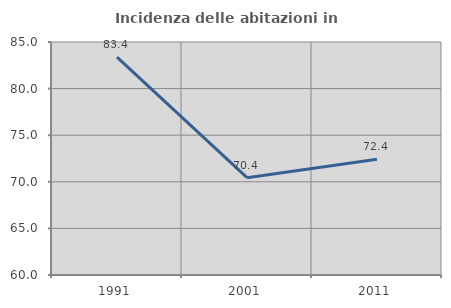
| Category | Incidenza delle abitazioni in proprietà  |
|---|---|
| 1991.0 | 83.369 |
| 2001.0 | 70.443 |
| 2011.0 | 72.416 |